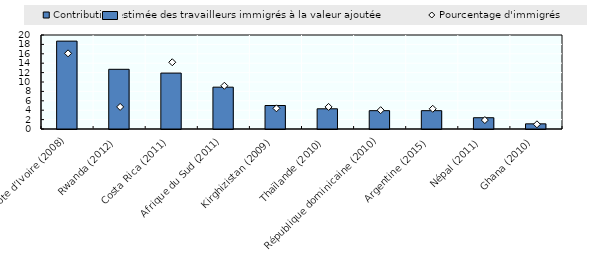
| Category | Contribution estimée des travailleurs immigrés à la valeur ajoutée |
|---|---|
| Côte d’Ivoire (2008) | 18.7 |
| Rwanda (2012) | 12.7 |
| Costa Rica (2011) | 11.9 |
| Afrique du Sud (2011) | 8.9 |
| Kirghizistan (2009) | 5 |
| Thaïlande (2010) | 4.3 |
| République dominicaine (2010) | 3.9 |
| Argentine (2015) | 3.9 |
| Népal (2011) | 2.4 |
| Ghana (2010) | 1.1 |